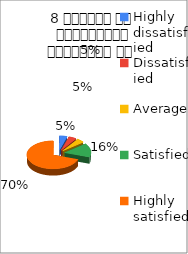
| Category | 8 शिक्षक का सम्प्रेषण सुस्पष्ठ है  |
|---|---|
| Highly dissatisfied | 3 |
| Dissatisfied | 3 |
| Average | 3 |
| Satisfied | 10 |
| Highly satisfied | 44 |